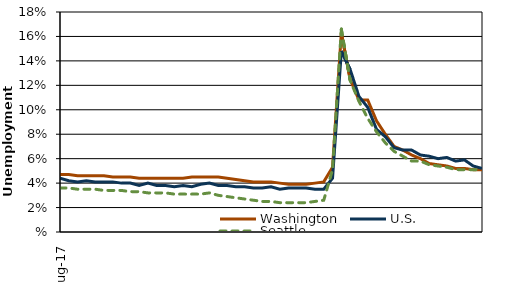
| Category | Washington | U.S. | Seattle |
|---|---|---|---|
| 2017-08-01 | 4.7 | 4.4 | 3.6 |
| 2017-09-01 | 4.7 | 4.2 | 3.6 |
| 2017-10-01 | 4.6 | 4.1 | 3.5 |
| 2017-11-01 | 4.6 | 4.2 | 3.5 |
| 2017-12-01 | 4.6 | 4.1 | 3.5 |
| 2018-01-01 | 4.6 | 4.1 | 3.4 |
| 2018-02-01 | 4.5 | 4.1 | 3.4 |
| 2018-03-01 | 4.5 | 4 | 3.4 |
| 2018-04-01 | 4.5 | 4 | 3.3 |
| 2018-05-01 | 4.4 | 3.8 | 3.3 |
| 2018-06-01 | 4.4 | 4 | 3.2 |
| 2018-07-01 | 4.4 | 3.8 | 3.2 |
| 2018-08-01 | 4.4 | 3.8 | 3.2 |
| 2018-09-01 | 4.4 | 3.7 | 3.1 |
| 2018-10-01 | 4.4 | 3.8 | 3.1 |
| 2018-11-01 | 4.5 | 3.7 | 3.1 |
| 2018-12-01 | 4.5 | 3.9 | 3.1 |
| 2019-01-01 | 4.5 | 4 | 3.2 |
| 2019-02-01 | 4.5 | 3.8 | 3 |
| 2019-03-01 | 4.4 | 3.8 | 2.9 |
| 2019-04-01 | 4.3 | 3.7 | 2.8 |
| 2019-05-01 | 4.2 | 3.7 | 2.7 |
| 2019-06-01 | 4.1 | 3.6 | 2.6 |
| 2019-07-01 | 4.1 | 3.6 | 2.5 |
| 2019-08-01 | 4.1 | 3.7 | 2.5 |
| 2019-09-01 | 4 | 3.5 | 2.4 |
| 2019-10-01 | 3.9 | 3.6 | 2.4 |
| 2019-11-01 | 3.9 | 3.6 | 2.4 |
| 2019-12-01 | 3.9 | 3.6 | 2.4 |
| 2020-01-01 | 4 | 3.5 | 2.5 |
| 2020-02-01 | 4.1 | 3.5 | 2.6 |
| 2020-03-01 | 5.3 | 4.4 | 5.1 |
| 2020-04-01 | 16.3 | 14.8 | 16.6 |
| 2020-05-01 | 12.5 | 13.3 | 12.4 |
| 2020-06-01 | 10.8 | 11.1 | 10.7 |
| 2020-07-01 | 10.8 | 10.2 | 9.3 |
| 2020-08-01 | 9.1 | 8.4 | 8.2 |
| 2020-09-01 | 8 | 7.8 | 7.3 |
| 2020-10-01 | 7 | 6.9 | 6.6 |
| 2020-11-01 | 6.7 | 6.7 | 6.2 |
| 2020-12-01 | 6.3 | 6.7 | 5.8 |
| 2021-01-01 | 6 | 6.3 | 5.8 |
| 2021-02-01 | 5.6 | 6.2 | 5.5 |
| 2021-03-01 | 5.5 | 6 | 5.4 |
| 2021-04-01 | 5.4 | 6.1 | 5.3 |
| 2021-05-01 | 5.2 | 5.8 | 5.1 |
| 2021-06-01 | 5.2 | 5.9 | 5.1 |
| 2021-07-01 | 5.1 | 5.4 | 5.1 |
| 2021-08-01 | 5.1 | 5.2 | 5.1 |